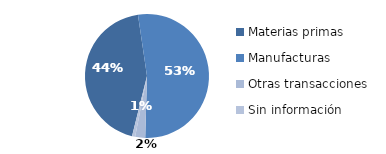
| Category | Series 0 |
|---|---|
| Materias primas | 1132.69 |
| Manufacturas | 1365.729 |
| Otras transacciones | 67.72 |
| Sin información | 21.147 |